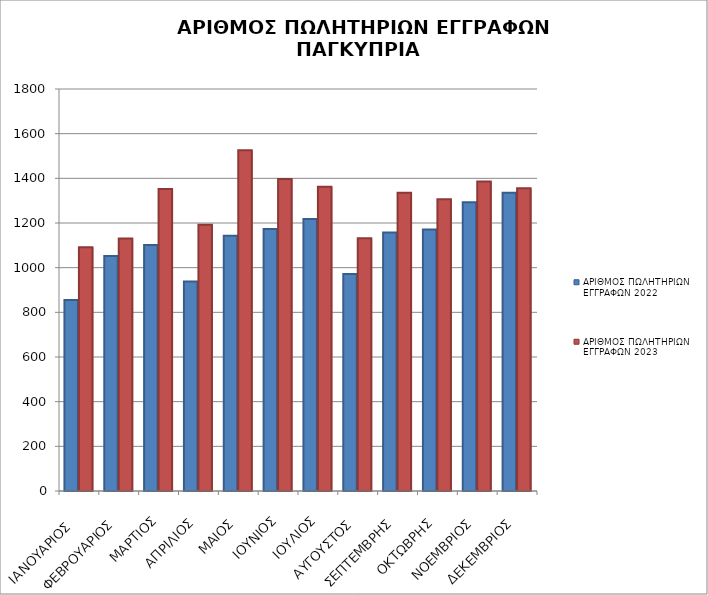
| Category | Συνολικό Αποδεχθέν Ποσό Υποθεσέων Ν81/70 (με επιτόπια έρευνα): | ΑΡΙΘΜΟΣ ΠΩΛΗΤΗΡΙΩΝ ΕΓΓΡΑΦΩΝ 2022 | ΑΡΙΘΜΟΣ ΠΩΛΗΤΗΡΙΩΝ ΕΓΓΡΑΦΩΝ 2023 |
|---|---|---|---|
| ΙΑΝΟΥΑΡΙΟΣ  |  | 855 | 1091 |
| ΦΕΒΡΟΥΑΡΙΟΣ |  | 1052 | 1131 |
| ΜΑΡΤΙΟΣ |  | 1102 | 1352 |
| ΑΠΡΙΛΙΟΣ |  | 938 | 1192 |
| ΜΑΙΟΣ |  | 1143 | 1526 |
| ΙΟΥΝΙΟΣ |  | 1173 | 1397 |
| ΙΟΥΛΙΟΣ |  | 1218 | 1362 |
| ΑΥΓΟΥΣΤΟΣ |  | 972 | 1132 |
| ΣΕΠΤΕΜΒΡΗΣ |  | 1157 | 1336 |
| ΟΚΤΩΒΡΗΣ |  | 1171 | 1306 |
| ΝΟΕΜΒΡΙΟΣ |  | 1293 | 1386 |
| ΔΕΚΕΜΒΡΙΟΣ |  | 1335 | 1356 |